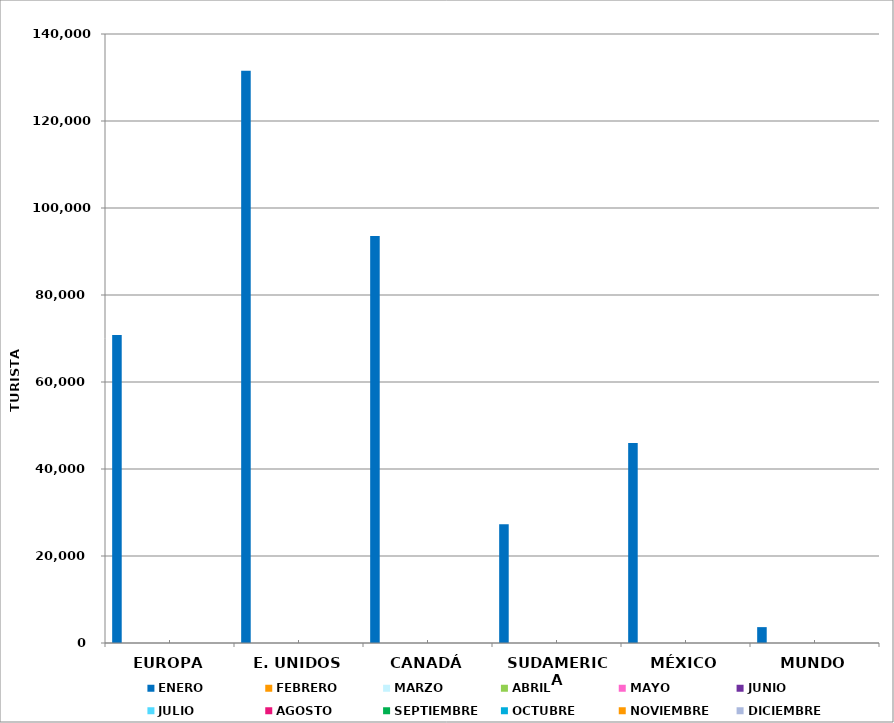
| Category | ENERO | FEBRERO | MARZO | ABRIL | MAYO | JUNIO | JULIO | AGOSTO | SEPTIEMBRE | OCTUBRE | NOVIEMBRE | DICIEMBRE |
|---|---|---|---|---|---|---|---|---|---|---|---|---|
| EUROPA | 70807 |  |  |  |  |  |  |  |  |  |  |  |
| E. UNIDOS | 131554 |  |  |  |  |  |  |  |  |  |  |  |
| CANADÁ | 93591 |  |  |  |  |  |  |  |  |  |  |  |
| SUDAMERICA | 27278 |  |  |  |  |  |  |  |  |  |  |  |
| MÉXICO | 45956 |  |  |  |  |  |  |  |  |  |  |  |
| MUNDO | 3650 |  |  |  |  |  |  |  |  |  |  |  |